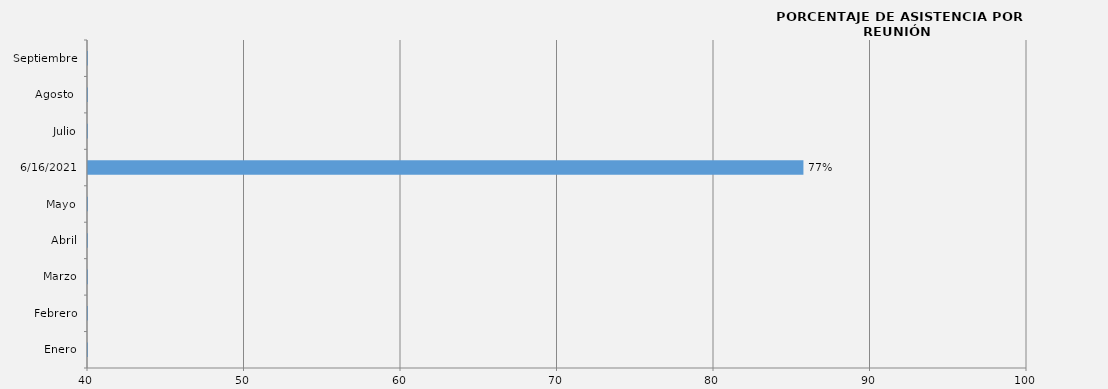
| Category | Series 0 |
|---|---|
| Enero | 0 |
| Febrero | 0 |
| Marzo | 0 |
| Abril | 0 |
| Mayo | 0 |
| 16/06/2021 | 85.714 |
| Julio | 0 |
| Agosto  | 0 |
| Septiembre | 0 |